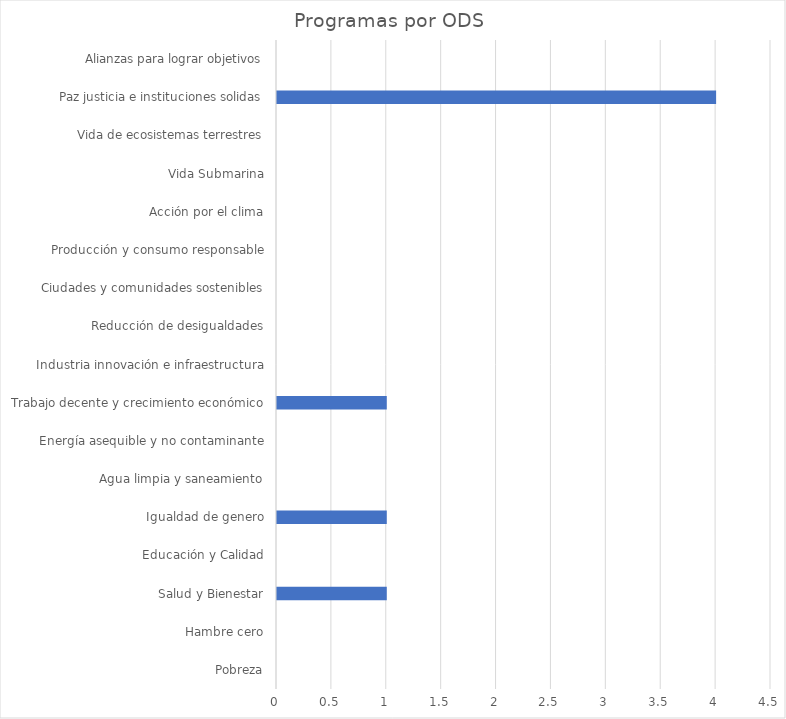
| Category | Series 0 |
|---|---|
| Pobreza | 0 |
| Hambre cero | 0 |
| Salud y Bienestar | 1 |
| Educación y Calidad | 0 |
| Igualdad de genero | 1 |
| Agua limpia y saneamiento | 0 |
| Energía asequible y no contaminante | 0 |
| Trabajo decente y crecimiento económico | 1 |
| Industria innovación e infraestructura | 0 |
| Reducción de desigualdades | 0 |
| Ciudades y comunidades sostenibles | 0 |
| Producción y consumo responsable | 0 |
| Acción por el clima | 0 |
| Vida Submarina | 0 |
| Vida de ecosistemas terrestres | 0 |
| Paz justicia e instituciones solidas | 4 |
| Alianzas para lograr objetivos | 0 |